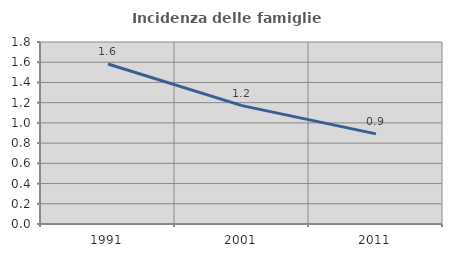
| Category | Incidenza delle famiglie numerose |
|---|---|
| 1991.0 | 1.582 |
| 2001.0 | 1.171 |
| 2011.0 | 0.891 |